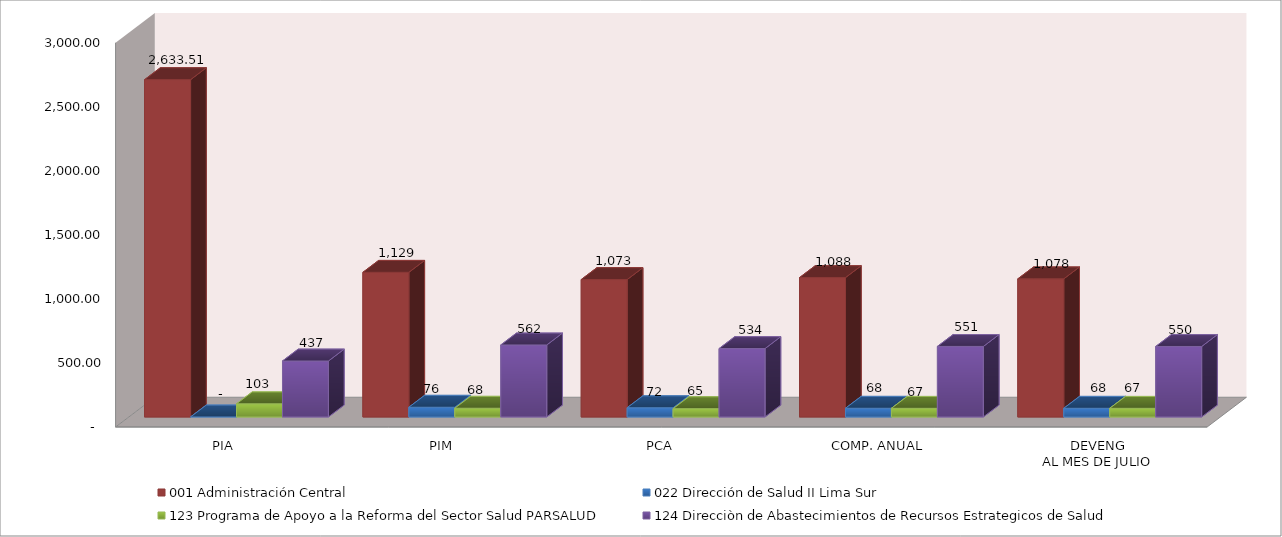
| Category | 001 Administración Central | 022 Dirección de Salud II Lima Sur | 123 Programa de Apoyo a la Reforma del Sector Salud PARSALUD | 124 Direcciòn de Abastecimientos de Recursos Estrategicos de Salud |
|---|---|---|---|---|
| PIA | 2633.509 | 0 | 102.766 | 436.8 |
| PIM | 1129.155 | 75.812 | 68.104 | 562.155 |
| PCA | 1072.698 | 72.022 | 64.699 | 534.047 |
| COMP. ANUAL | 1087.857 | 67.808 | 67.357 | 550.641 |
| DEVENG
AL MES DE JULIO | 1078.158 | 67.63 | 67.337 | 550.284 |